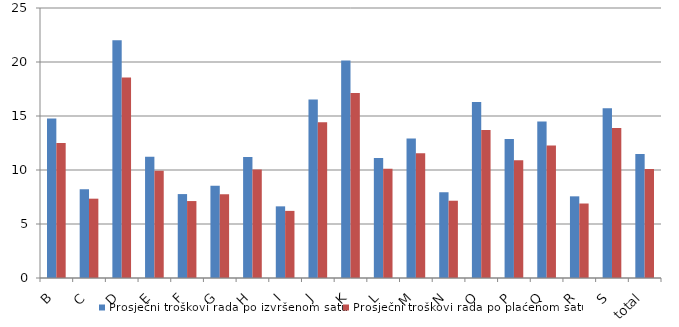
| Category | Prosječni troškovi rada po izvršenom satu | Prosječni troškovi rada po plaćenom satu |
|---|---|---|
| B | 14.767 | 12.503 |
| C | 8.222 | 7.344 |
| D | 22.021 | 18.559 |
| E | 11.231 | 9.93 |
| F | 7.77 | 7.125 |
| G | 8.55 | 7.754 |
| H | 11.192 | 10.047 |
| I | 6.634 | 6.214 |
| J | 16.52 | 14.419 |
| K | 20.146 | 17.136 |
| L | 11.111 | 10.106 |
| M | 12.915 | 11.551 |
| N | 7.933 | 7.155 |
| O | 16.292 | 13.699 |
| P | 12.867 | 10.906 |
| Q | 14.491 | 12.273 |
| R | 7.562 | 6.898 |
| S | 15.719 | 13.882 |
| total | 11.475 | 10.091 |